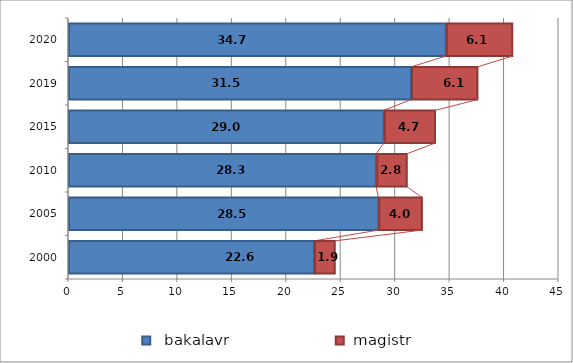
| Category |   bakalavr      |  magistr    |
|---|---|---|
| 2000 | 22.6 | 1.9 |
| 2005 | 28.5 | 4 |
| 2010 | 28.3 | 2.8 |
| 2015 | 29 | 4.7 |
| 2019 | 31.5 | 6.1 |
| 2020 | 34.7 | 6.1 |